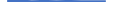
| Category | Series 0 |
|---|---|
| 0 | 103 |
| 1 | 127 |
| 2 | 87 |
| 3 | 106 |
| 4 | 85 |
| 5 | 105 |
| 6 | 79 |
| 7 | 77 |
| 8 | 87 |